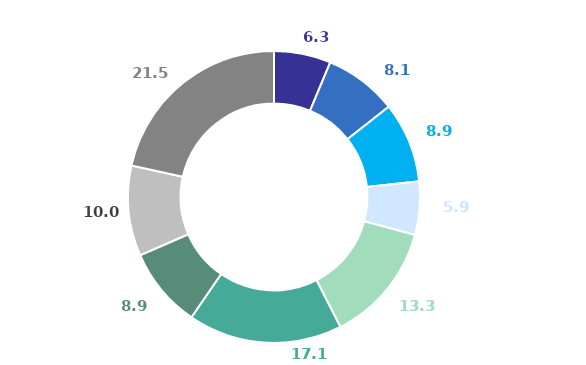
| Category | Series 0 |
|---|---|
| Раздел A | 6.3 |
| Раздел B | 8.1 |
| Раздел C | 8.9 |
| Раздел F | 5.9 |
| Раздел G | 13.3 |
| Раздел L | 17.1 |
| Раздел O | 8.9 |
| Раздел Н | 10 |
| Раздел НД | 21.547 |